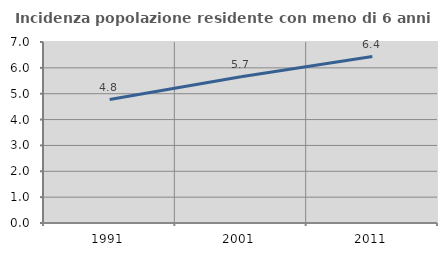
| Category | Incidenza popolazione residente con meno di 6 anni |
|---|---|
| 1991.0 | 4.774 |
| 2001.0 | 5.66 |
| 2011.0 | 6.438 |